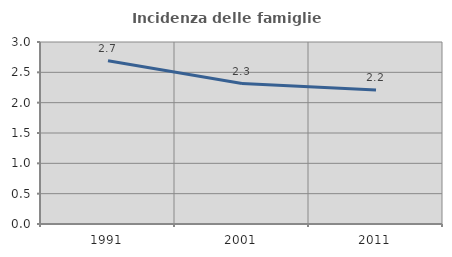
| Category | Incidenza delle famiglie numerose |
|---|---|
| 1991.0 | 2.691 |
| 2001.0 | 2.315 |
| 2011.0 | 2.208 |